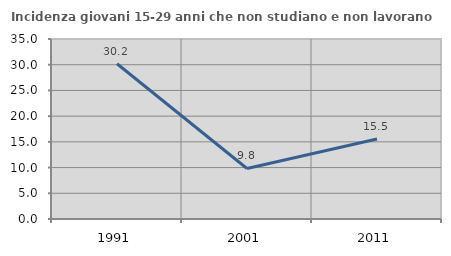
| Category | Incidenza giovani 15-29 anni che non studiano e non lavorano  |
|---|---|
| 1991.0 | 30.189 |
| 2001.0 | 9.823 |
| 2011.0 | 15.542 |